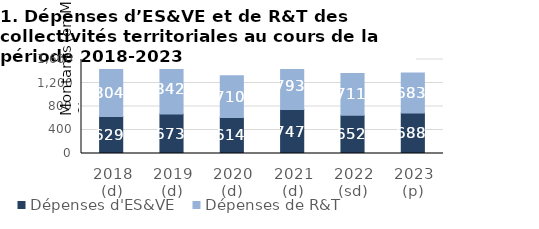
| Category | Dépenses d'ES&VE | Dépenses de R&T |
|---|---|---|
| 2018
(d) | 629.2 | 804.2 |
| 2019
(d) | 673.1 | 842.2 |
| 2020
(d) | 613.5 | 710.1 |
| 2021
(d) | 746.9 | 793.3 |
| 2022
(sd) | 652.4 | 710.6 |
| 2023
(p) | 688.4 | 682.9 |